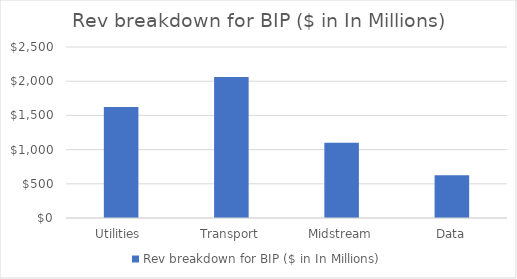
| Category | Rev breakdown for BIP ($ in In Millions) |
|---|---|
| Utilities  | 1623 |
| Transport | 2062 |
| Midstream | 1101 |
| Data | 625 |